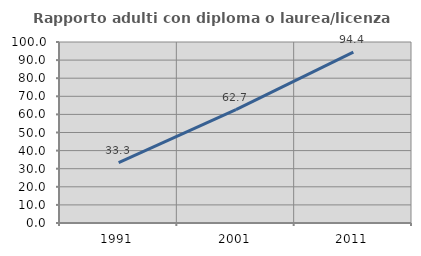
| Category | Rapporto adulti con diploma o laurea/licenza media  |
|---|---|
| 1991.0 | 33.333 |
| 2001.0 | 62.651 |
| 2011.0 | 94.41 |